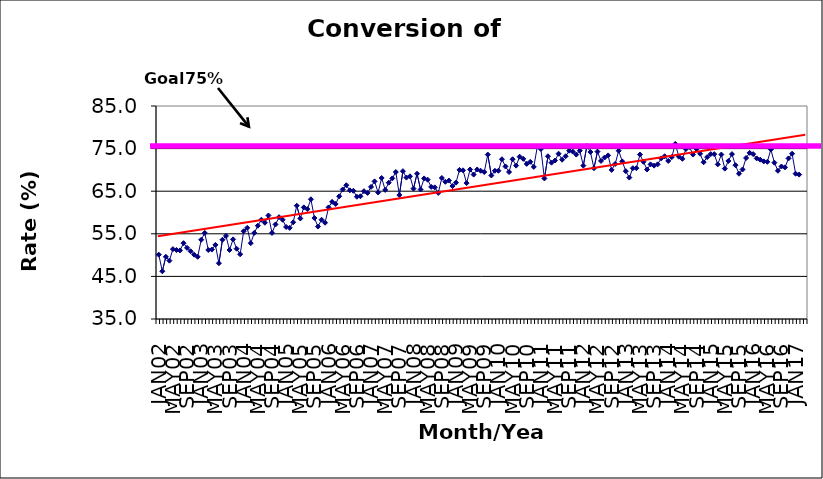
| Category | Series 0 |
|---|---|
| JAN02 | 50.1 |
| FEB02 | 46.2 |
| MAR02 | 49.6 |
| APR02 | 48.7 |
| MAY02 | 51.4 |
| JUN02 | 51.2 |
| JUL02 | 51.1 |
| AUG02 | 52.8 |
| SEP02 | 51.7 |
| OCT02 | 50.9 |
| NOV02 | 50.1 |
| DEC02 | 49.6 |
| JAN03 | 53.6 |
| FEB03 | 55.2 |
| MAR03 | 51.2 |
| APR03 | 51.3 |
| MAY03 | 52.4 |
| JUN03 | 48.1 |
| JUL03 | 53.6 |
| AUG03 | 54.5 |
| SEP03 | 51.2 |
| OCT03 | 53.7 |
| NOV03 | 51.5 |
| DEC03 | 50.2 |
| JAN04 | 55.6 |
| FEB04 | 56.4 |
| MAR04 | 52.8 |
| APR04 | 55.2 |
| MAY04 | 56.9 |
| JUN04 | 58.3 |
| JUL04 | 57.6 |
| AUG04 | 59.3 |
| SEP04 | 55.2 |
| OCT04 | 57.2 |
| NOV04 | 58.9 |
| DEC04 | 58.3 |
| JAN05 | 56.6 |
| FEB05 | 56.4 |
| MAR05 | 57.7 |
| APR05 | 61.6 |
| MAY05 | 58.6 |
| JUN05 | 61.2 |
| JUL05 | 60.8 |
| AUG05 | 63.1 |
| SEP05 | 58.7 |
| OCT05 | 56.7 |
| NOV05 | 58.3 |
| DEC05 | 57.6 |
| JAN06 | 61.2 |
| FEB06 | 62.5 |
| MAR06 | 62 |
| APR06 | 63.8 |
| MAY06 | 65.4 |
| JUN06 | 66.4 |
| JUL06 | 65.2 |
| AUG06 | 65.1 |
| SEP06 | 63.7 |
| OCT06 | 63.8 |
| NOV06 | 65 |
| DEC06 | 64.6 |
| JAN07 | 66 |
| FEB07 | 67.3 |
| MAR07 | 64.7 |
| APR07 | 68.1 |
| MAY07 | 65.3 |
| JUN07 | 67 |
| JUL07 | 68 |
| AUG07 | 69.5 |
| SEP07 | 64.1 |
| OCT07 | 69.7 |
| NOV07 | 68.2 |
| DEC07 | 68.5 |
| JAN08 | 65.6 |
| FEB08 | 69.1 |
| MAR08 | 65.4 |
| APR08 | 68 |
| MAY08 | 67.7 |
| JUN08 | 66 |
| JUL08 | 65.9 |
| AUG08 | 64.6 |
| SEP08 | 68.1 |
| OCT08 | 67.2 |
| NOV08 | 67.5 |
| DEC08 | 66.2 |
| JAN09 | 67 |
| FEB09 | 70 |
| MAR09 | 69.9 |
| APR09 | 66.9 |
| MAY09 | 70.1 |
| JUN09 | 68.9 |
| JUL09 | 70.1 |
| AUG09 | 69.8 |
| SEP09 | 69.5 |
| OCT09 | 73.6 |
| NOV09 | 68.7 |
| DEC09 | 69.8 |
| JAN10 | 69.8 |
| FEB10 | 72.5 |
| MAR10 | 70.8 |
| APR10 | 69.5 |
| MAY10 | 72.5 |
| JUN10 | 71 |
| JUL10 | 73.1 |
| AUG10 | 72.6 |
| SEP10 | 71.4 |
| OCT10 | 71.9 |
| NOV10 | 70.7 |
| DEC10 | 75.5 |
| JAN11 | 74.9 |
| FEB11 | 68 |
| MAR11 | 73.2 |
| APR11 | 71.7 |
| MAY11 | 72.2 |
| JUN11 | 73.8 |
| JUL11 | 72.4 |
| AUG11 | 73.2 |
| SEP11 | 74.5 |
| OCT11 | 74.3 |
| NOV11 | 73.6 |
| DEC11 | 74.5 |
| JAN12 | 71 |
| FEB12 | 75.6 |
| MAR12 | 74.2 |
| APR12 | 70.4 |
| MAY12 | 74.3 |
| JUN12 | 72.1 |
| JUL12 | 72.9 |
| AUG12 | 73.4 |
| SEP12 | 70 |
| OCT12 | 71.4 |
| NOV12 | 74.5 |
| DEC12 | 72 |
| JAN13 | 69.7 |
| FEB13 | 68.2 |
| MAR13 | 70.4 |
| APR13 | 70.4 |
| MAY13 | 73.6 |
| JUN13 | 71.9 |
| JUL13 | 70.1 |
| AUG13 | 71.3 |
| SEP13 | 71 |
| OCT13 | 71.3 |
| NOV13 | 72.7 |
| DEC13 | 73.2 |
| JAN14 | 72.1 |
| FEB14 | 73 |
| MAR14 | 76.1 |
| APR14 | 73.1 |
| MAY14 | 72.6 |
| JUN14 | 74.9 |
| JUL14 | 75.4 |
| AUG14 | 73.6 |
| SEP14 | 74.9 |
| OCT14 | 73.8 |
| NOV14 | 71.8 |
| DEC14 | 73 |
| JAN15 | 73.7 |
| FEB15 | 73.7 |
| MAR15 | 71.3 |
| APR15 | 73.6 |
| MAY15 | 70.3 |
| JUN15 | 72.1 |
| JUL15 | 73.7 |
| AUG15 | 71.1 |
| SEP15 | 69.1 |
| OCT15 | 70.1 |
| NOV15 | 72.8 |
| DEC15 | 74 |
| JAN16 | 73.7 |
| FEB16 | 72.7 |
| MAR16 | 72.4 |
| APR16 | 72 |
| MAY16 | 71.9 |
| JUN16 | 74.8 |
| JUL16 | 71.7 |
| AUG16 | 69.8 |
| SEP16 | 70.8 |
| OCT16 | 70.6 |
| NOV16 | 72.7 |
| DEC16 | 73.8 |
| JAN17 | 69.1 |
| FEB17 | 68.9 |